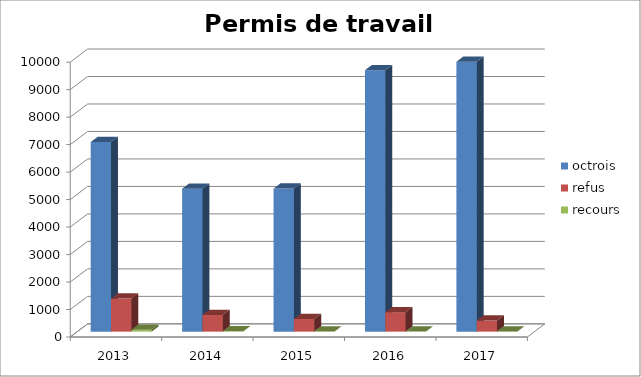
| Category | octrois | refus | recours |
|---|---|---|---|
| 2013.0 | 6897 | 1202 | 68 |
| 2014.0 | 5198 | 609 | 13 |
| 2015.0 | 5204 | 458 | 6 |
| 2016.0 | 9512 | 709 | 2 |
| 2017.0 | 9819 | 403 | 8 |